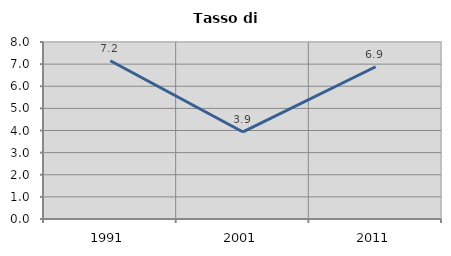
| Category | Tasso di disoccupazione   |
|---|---|
| 1991.0 | 7.152 |
| 2001.0 | 3.934 |
| 2011.0 | 6.883 |